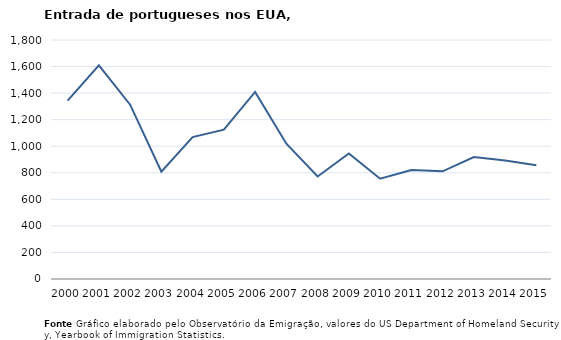
| Category | Entradas |
|---|---|
| 2000.0 | 1343 |
| 2001.0 | 1609 |
| 2002.0 | 1313 |
| 2003.0 | 808 |
| 2004.0 | 1069 |
| 2005.0 | 1125 |
| 2006.0 | 1409 |
| 2007.0 | 1019 |
| 2008.0 | 772 |
| 2009.0 | 946 |
| 2010.0 | 755 |
| 2011.0 | 821 |
| 2012.0 | 811 |
| 2013.0 | 918 |
| 2014.0 | 892 |
| 2015.0 | 857 |